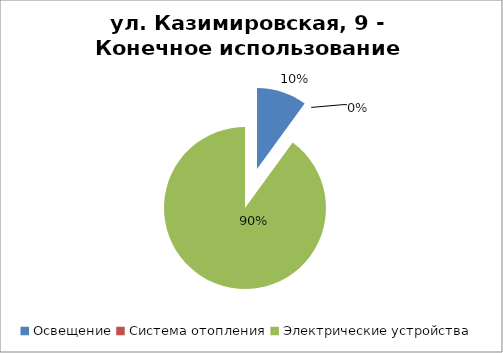
| Category | Series 0 |
|---|---|
| Освещение | 312.395 |
| Система отопления | 0 |
| Электрические устройства | 2808.598 |